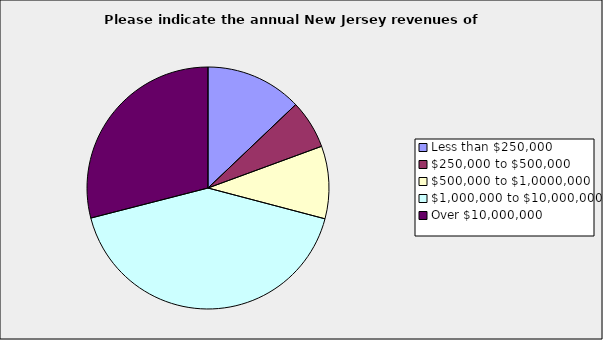
| Category | Series 0 |
|---|---|
| Less than $250,000 | 0.129 |
| $250,000 to $500,000 | 0.065 |
| $500,000 to $1,0000,000 | 0.097 |
| $1,000,000 to $10,000,000 | 0.419 |
| Over $10,000,000 | 0.29 |